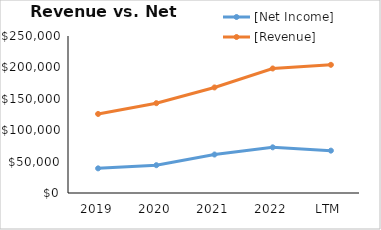
| Category | [Net Income] | [Revenue] |
|---|---|---|
| 2019 | 39240 | 125843 |
| 2020 | 44281 | 143015 |
| 2021 | 61271 | 168088 |
| 2022 | 72738 | 198270 |
| LTM | 67449 | 204094 |